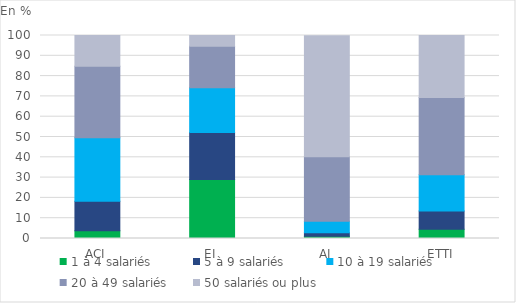
| Category | 1 à 4 salariés | 5 à 9 salariés | 10 à 19 salariés | 20 à 49 salariés | 50 salariés ou plus |
|---|---|---|---|---|---|
| ACI | 3.8 | 14.5 | 31.3 | 35.3 | 15.1 |
| EI | 29.1 | 23.1 | 22 | 20.5 | 5.3 |
| AI | 1.1 | 1.7 | 5.7 | 31.8 | 59.6 |
| ETTI | 4.6 | 9 | 17.8 | 38 | 30.6 |